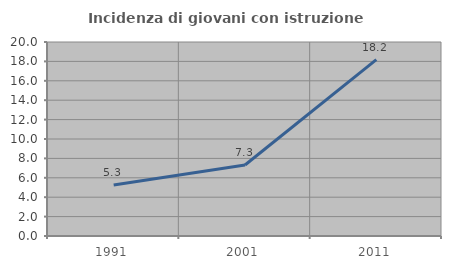
| Category | Incidenza di giovani con istruzione universitaria |
|---|---|
| 1991.0 | 5.263 |
| 2001.0 | 7.317 |
| 2011.0 | 18.182 |